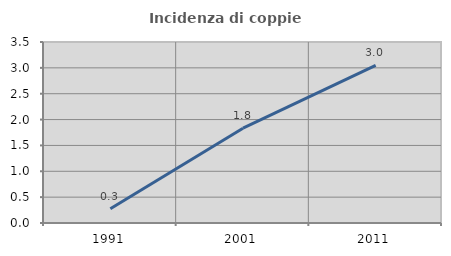
| Category | Incidenza di coppie miste |
|---|---|
| 1991.0 | 0.276 |
| 2001.0 | 1.833 |
| 2011.0 | 3.047 |